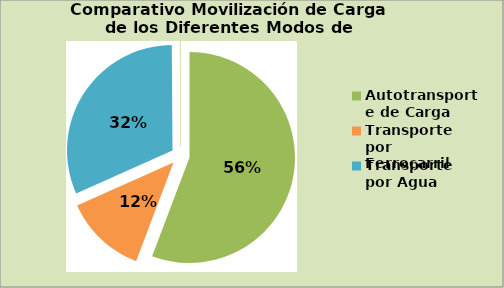
| Category | Series 0 |
|---|---|
| Autotransporte de Carga | 498 |
| Transporte por Ferrocarril | 112 |
| Transporte por Agua | 282 |
| Transporte Aéreo | 1 |